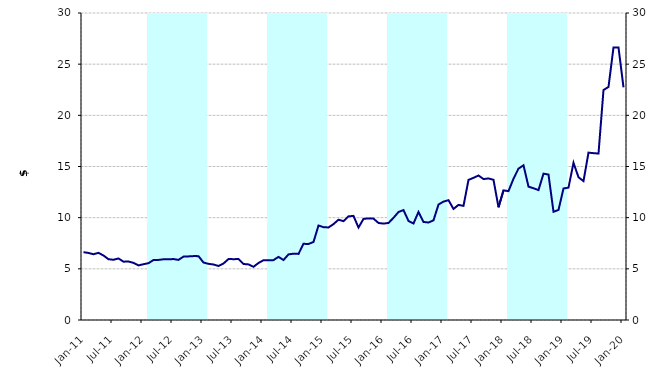
| Category | Series 1 |
|---|---|
| 0 | 0 |
| 1900-01-01 | 0 |
| 1900-01-02 | 0 |
| 1900-01-03 | 0 |
| 1900-01-04 | 0 |
| 1900-01-05 | 0 |
| 1900-01-06 | 0 |
| 1900-01-07 | 0 |
| 1900-01-08 | 0 |
| 1900-01-09 | 0 |
| 1900-01-10 | 0 |
| 1900-01-11 | 0 |
| 1900-01-12 | 0 |
| 1900-01-13 | 30000000 |
| 1900-01-14 | 30000000 |
| 1900-01-15 | 30000000 |
| 1900-01-16 | 30000000 |
| 1900-01-17 | 30000000 |
| 1900-01-18 | 30000000 |
| 1900-01-19 | 30000000 |
| 1900-01-20 | 30000000 |
| 1900-01-21 | 30000000 |
| 1900-01-22 | 30000000 |
| 1900-01-23 | 30000000 |
| 1900-01-24 | 30000000 |
| 1900-01-25 | 0 |
| 1900-01-26 | 0 |
| 1900-01-27 | 0 |
| 1900-01-28 | 0 |
| 1900-01-29 | 0 |
| 1900-01-30 | 0 |
| 1900-01-31 | 0 |
| 1900-02-01 | 0 |
| 1900-02-02 | 0 |
| 1900-02-03 | 0 |
| 1900-02-04 | 0 |
| 1900-02-05 | 0 |
| 1900-02-06 | 30000000 |
| 1900-02-07 | 30000000 |
| 1900-02-08 | 30000000 |
| 1900-02-09 | 30000000 |
| 1900-02-10 | 30000000 |
| 1900-02-11 | 30000000 |
| 1900-02-12 | 30000000 |
| 1900-02-13 | 30000000 |
| 1900-02-14 | 30000000 |
| 1900-02-15 | 30000000 |
| 1900-02-16 | 30000000 |
| 1900-02-17 | 30000000 |
| 1900-02-18 | 0 |
| 1900-02-19 | 0 |
| 1900-02-20 | 0 |
| 1900-02-21 | 0 |
| 1900-02-22 | 0 |
| 1900-02-23 | 0 |
| 1900-02-24 | 0 |
| 1900-02-25 | 0 |
| 1900-02-26 | 0 |
| 1900-02-27 | 0 |
| 1900-02-28 | 0 |
| 1900-02-28 | 0 |
| 1900-03-01 | 30000000 |
| 1900-03-02 | 30000000 |
| 1900-03-03 | 30000000 |
| 1900-03-04 | 30000000 |
| 1900-03-05 | 30000000 |
| 1900-03-06 | 30000000 |
| 1900-03-07 | 30000000 |
| 1900-03-08 | 30000000 |
| 1900-03-09 | 30000000 |
| 1900-03-10 | 30000000 |
| 1900-03-11 | 30000000 |
| 1900-03-12 | 30000000 |
| 1900-03-13 | 0 |
| 1900-03-14 | 0 |
| 1900-03-15 | 0 |
| 1900-03-16 | 0 |
| 1900-03-17 | 0 |
| 1900-03-18 | 0 |
| 1900-03-19 | 0 |
| 1900-03-20 | 0 |
| 1900-03-21 | 0 |
| 1900-03-22 | 0 |
| 1900-03-23 | 0 |
| 1900-03-24 | 0 |
| 1900-03-25 | 30000000 |
| 1900-03-26 | 30000000 |
| 1900-03-27 | 30000000 |
| 1900-03-28 | 30000000 |
| 1900-03-29 | 30000000 |
| 1900-03-30 | 30000000 |
| 1900-03-31 | 30000000 |
| 1900-04-01 | 30000000 |
| 1900-04-02 | 30000000 |
| 1900-04-03 | 30000000 |
| 1900-04-04 | 30000000 |
| 1900-04-05 | 30000000 |
| 1900-04-06 | 0 |
| 1900-04-07 | 0 |
| 1900-04-08 | 0 |
| 1900-04-09 | 0 |
| 1900-04-10 | 0 |
| 1900-04-11 | 0 |
| 1900-04-12 | 0 |
| 1900-04-13 | 0 |
| 1900-04-14 | 0 |
| 1900-04-15 | 0 |
| 1900-04-16 | 0 |
| 1900-04-17 | 0 |